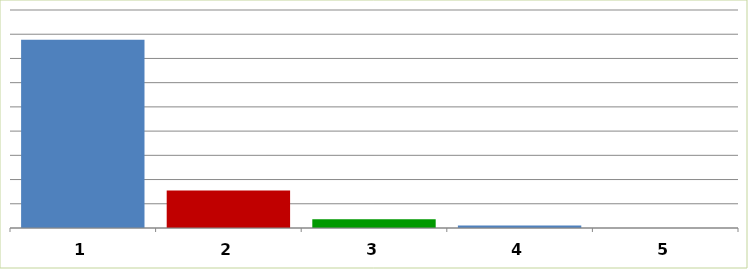
| Category | Series 0 |
|---|---|
| 0 | 77674839 |
| 1 | 15476514 |
| 2 | 3586834 |
| 3 | 1011000 |
| 4 | 0 |